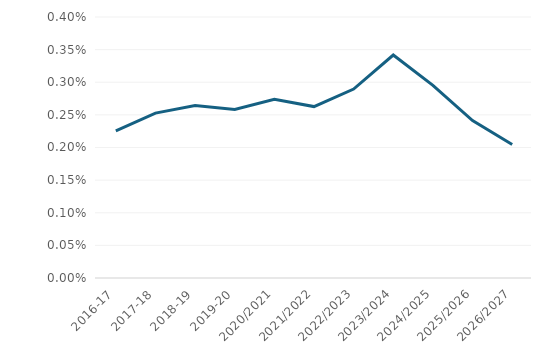
| Category | Aid/GNI |
|---|---|
| 2016-17 | 0.002 |
| 2017-18 | 0.003 |
| 2018-19 | 0.003 |
| 2019-20 | 0.003 |
| 2020/2021 | 0.003 |
| 2021/2022 | 0.003 |
| 2022/2023 | 0.003 |
| 2023/2024 | 0.003 |
| 2024/2025 | 0.003 |
| 2025/2026 | 0.002 |
| 2026/2027 | 0.002 |